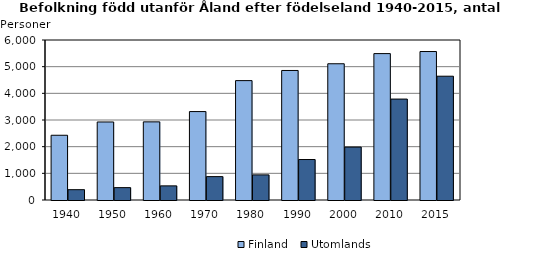
| Category | Finland  | Utomlands |
|---|---|---|
| 1940.0 | 2428 | 387 |
| 1950.0 | 2926 | 464 |
| 1960.0 | 2930 | 530 |
| 1970.0 | 3316 | 877 |
| 1980.0 | 4477 | 942 |
| 1990.0 | 4857 | 1518 |
| 2000.0 | 5109 | 1985 |
| 2010.0 | 5490 | 3785 |
| 2015.0 | 5568 | 4642 |